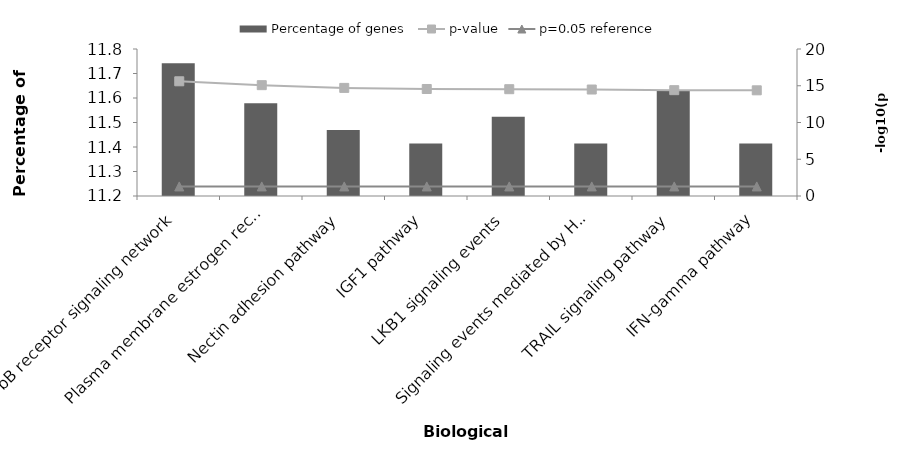
| Category | Percentage of genes |
|---|---|
| ErbB receptor signaling network | 11.742 |
| Plasma membrane estrogen receptor signaling | 11.578 |
| Nectin adhesion pathway | 11.469 |
| IGF1 pathway | 11.415 |
| LKB1 signaling events | 11.524 |
| Signaling events mediated by Hepatocyte Growth Factor Receptor (c-Met) | 11.415 |
| TRAIL signaling pathway | 11.633 |
| IFN-gamma pathway | 11.415 |